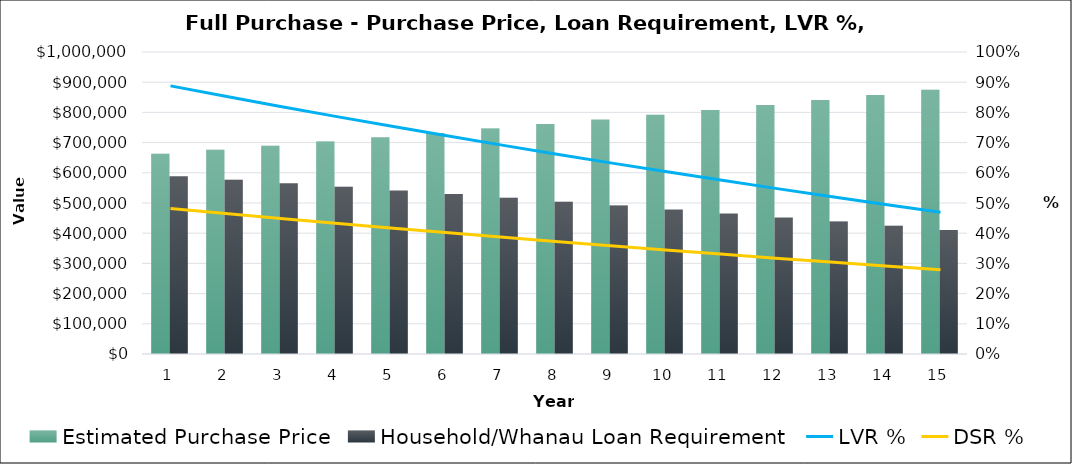
| Category | Estimated Purchase Price | Household/Whanau Loan Requirement  |
|---|---|---|
| 0 | 663000 | 588659.56 |
| 1 | 676260 | 577152.311 |
| 2 | 689785.2 | 565474.917 |
| 3 | 703580.904 | 553623.976 |
| 4 | 717652.522 | 541596.015 |
| 5 | 732005.573 | 529387.496 |
| 6 | 746645.684 | 516994.806 |
| 7 | 761578.598 | 504414.262 |
| 8 | 776810.17 | 491642.107 |
| 9 | 792346.373 | 478674.509 |
| 10 | 808193.3 | 465507.559 |
| 11 | 824357.166 | 452137.27 |
| 12 | 840844.31 | 438559.576 |
| 13 | 857661.196 | 424770.327 |
| 14 | 874814.42 | 410765.294 |